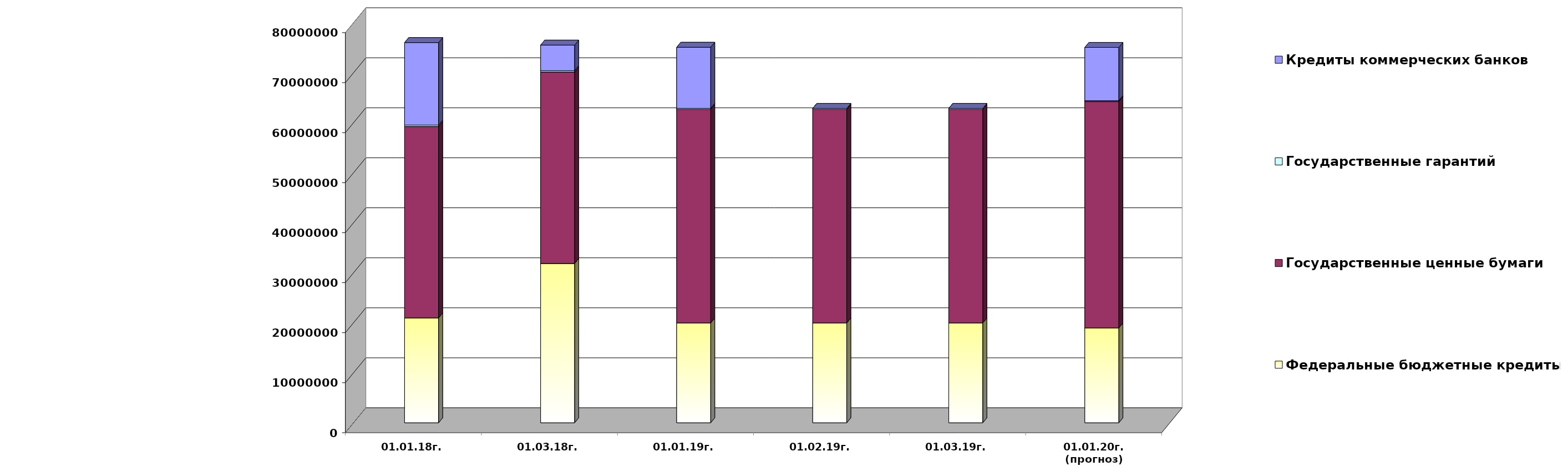
| Category | Федеральные бюджетные кредиты | Государственные ценные бумаги  | Государственные гарантий | Кредиты коммерческих банков |
|---|---|---|---|---|
| 01.01.18г. | 20959084.963 | 38300000 | 267412.82 | 16500000 |
| 01.03.18г. | 31846902.963 | 38300000 | 262100.52 | 5112182 |
| 01.01.19г. | 19957026.213 | 42700000 | 209872.86 | 12219963.75 |
| 01.02.19г. | 19957026.213 | 42700000 | 200735.86 | 0 |
| 01.03.19г. | 19957026.213 | 42700000 | 200735.86 | 0 |
| 01.01.20г.
(прогноз) | 18954967.4 | 45300000 | 155130 | 10650535.9 |